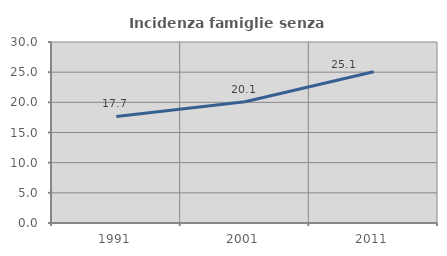
| Category | Incidenza famiglie senza nuclei |
|---|---|
| 1991.0 | 17.663 |
| 2001.0 | 20.105 |
| 2011.0 | 25.081 |